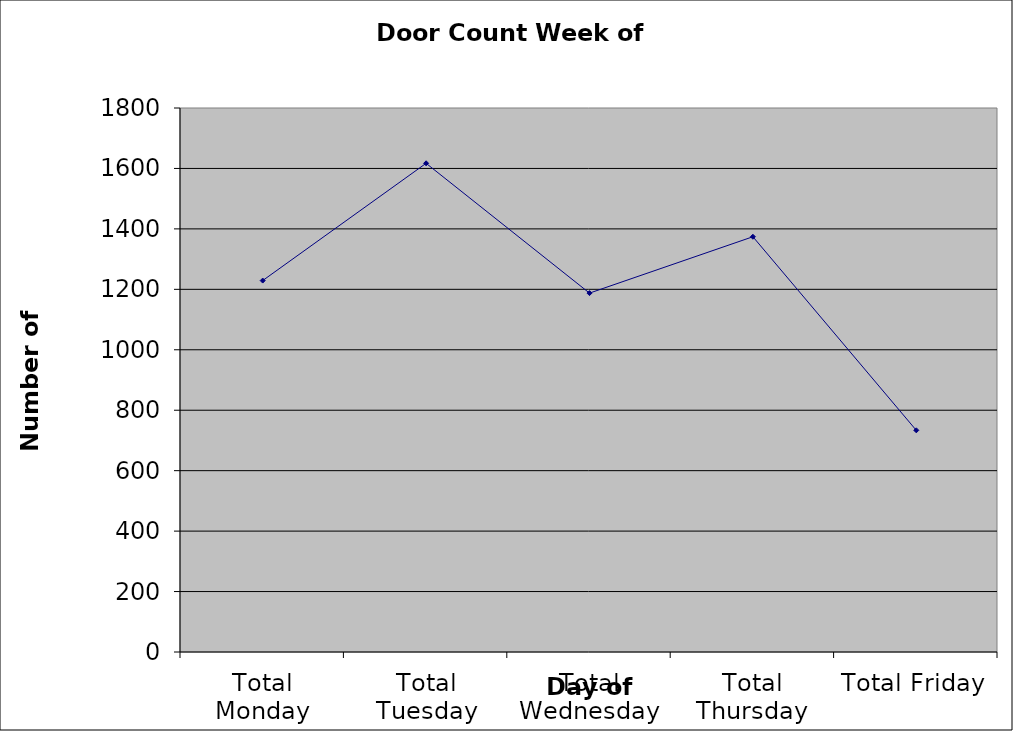
| Category | Series 0 |
|---|---|
| Total Monday | 1229 |
| Total Tuesday | 1617 |
| Total Wednesday | 1187.5 |
| Total Thursday | 1374 |
| Total Friday | 733.5 |